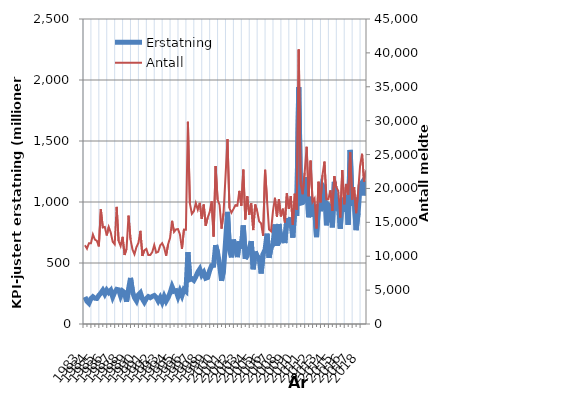
| Category | Erstatning |
|---|---|
| 1983.0 | 221.949 |
| nan | 185.917 |
| nan | 170.02 |
| nan | 208.268 |
| 1984.0 | 223.332 |
| nan | 211.256 |
| nan | 209.456 |
| nan | 234.278 |
| 1985.0 | 253.168 |
| nan | 276.72 |
| nan | 245.206 |
| nan | 278.097 |
| 1986.0 | 257.839 |
| nan | 275.898 |
| nan | 222.061 |
| nan | 259.862 |
| 1987.0 | 283.894 |
| nan | 280.151 |
| nan | 229.26 |
| nan | 269.731 |
| 1988.0 | 256.73 |
| nan | 183.009 |
| nan | 285.041 |
| nan | 377.599 |
| 1989.0 | 266.765 |
| nan | 215.61 |
| nan | 189.719 |
| nan | 239.351 |
| 1990.0 | 256.282 |
| nan | 206.18 |
| nan | 178.813 |
| nan | 208.132 |
| 1991.0 | 224.594 |
| nan | 215.946 |
| nan | 226.002 |
| nan | 233.658 |
| 1992.0 | 218.279 |
| nan | 188.082 |
| nan | 217.323 |
| nan | 179.335 |
| 1993.0 | 225.016 |
| nan | 187.263 |
| nan | 216.35 |
| nan | 255.948 |
| 1994.0 | 306.554 |
| nan | 267.998 |
| nan | 272.283 |
| nan | 224.429 |
| 1995.0 | 270.389 |
| nan | 232.615 |
| nan | 282.652 |
| nan | 268.364 |
| 1996.0 | 588.52 |
| nan | 364.421 |
| nan | 370.932 |
| nan | 357.735 |
| 1997.0 | 387.279 |
| nan | 424.973 |
| nan | 450.052 |
| nan | 401.55 |
| 1998.0 | 423.625 |
| nan | 375.292 |
| nan | 381.423 |
| nan | 438.403 |
| 1999.0 | 478.172 |
| nan | 480.494 |
| nan | 646.566 |
| nan | 585.551 |
| 2000.0 | 488.096 |
| nan | 354.465 |
| nan | 439.436 |
| nan | 670.004 |
| 2001.0 | 919.504 |
| nan | 608.715 |
| nan | 546.707 |
| nan | 691.697 |
| 2002.0 | 629.967 |
| nan | 548.133 |
| nan | 677.398 |
| nan | 617.261 |
| 2003.0 | 807.292 |
| nan | 533.752 |
| nan | 567.845 |
| nan | 618.583 |
| 2004.0 | 678.619 |
| nan | 448.657 |
| nan | 593.143 |
| nan | 554.406 |
| 2005.0 | 542.628 |
| nan | 414.1 |
| nan | 574.883 |
| nan | 609.232 |
| 2006.0 | 740.532 |
| nan | 543.078 |
| nan | 624.878 |
| nan | 651.921 |
| 2007.0 | 816.008 |
| nan | 641.555 |
| nan | 819.694 |
| nan | 693.036 |
| 2008.0 | 716.689 |
| nan | 663.474 |
| nan | 866.535 |
| nan | 832.218 |
| 2009.0 | 873.32 |
| nan | 708.997 |
| nan | 936.566 |
| nan | 885.25 |
| 2010.0 | 1941.881 |
| nan | 990.456 |
| nan | 995.22 |
| nan | 1018.153 |
| 2011.0 | 1203.27 |
| nan | 874.99 |
| nan | 1043.291 |
| nan | 879.248 |
| 2012.0 | 974.087 |
| nan | 712.146 |
| nan | 981.851 |
| nan | 924.505 |
| 2013.0 | 1135.389 |
| nan | 1111.761 |
| nan | 808.968 |
| nan | 977.139 |
| 2014.0 | 963.722 |
| nan | 791.406 |
| nan | 1164.2 |
| nan | 930.848 |
| 2015.0 | 1021.261 |
| nan | 782.106 |
| nan | 1035.286 |
| nan | 919.216 |
| 2016.0 | 1056.711 |
| nan | 813.389 |
| nan | 1426.54 |
| nan | 967.908 |
| 2017.0 | 1037.584 |
| nan | 769.551 |
| nan | 908.847 |
| nan | 1134.849 |
| 2018.0 | 1158.517 |
| nan | 1053.942 |
| nan | 1174.703 |